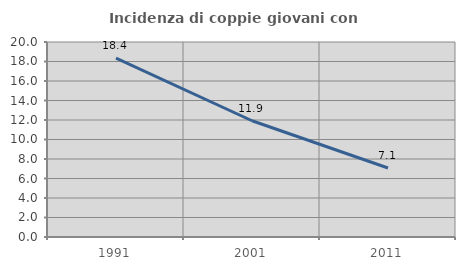
| Category | Incidenza di coppie giovani con figli |
|---|---|
| 1991.0 | 18.357 |
| 2001.0 | 11.924 |
| 2011.0 | 7.081 |